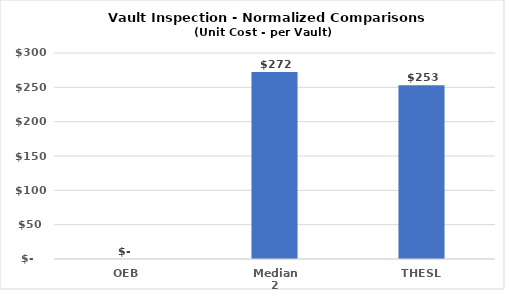
| Category | Series 0 |
|---|---|
| OEB | 0 |
| Median 2 | 272.35 |
| THESL | 253 |